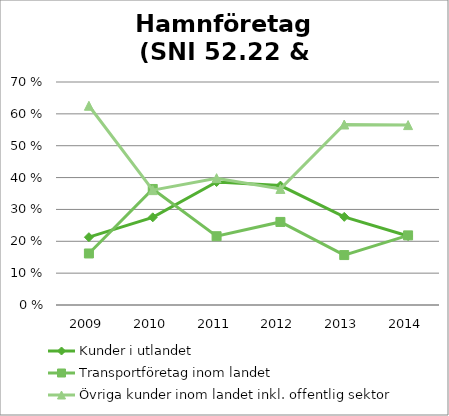
| Category | Kunder i utlandet | Transportföretag inom landet | Övriga kunder inom landet inkl. offentlig sektor |
|---|---|---|---|
| 2009.0 | 0.213 | 0.162 | 0.625 |
| 2010.0 | 0.275 | 0.364 | 0.361 |
| 2011.0 | 0.386 | 0.216 | 0.398 |
| 2012.0 | 0.375 | 0.261 | 0.364 |
| 2013.0 | 0.277 | 0.157 | 0.567 |
| 2014.0 | 0.217 | 0.219 | 0.565 |